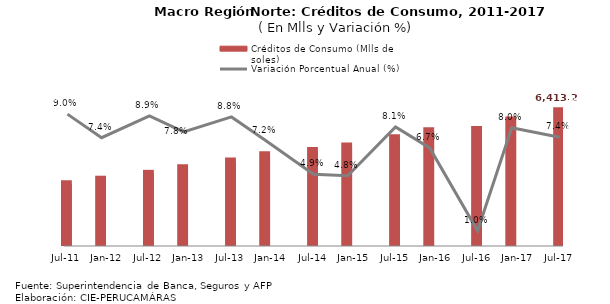
| Category | Créditos de Consumo (Mlls de soles) |
|---|---|
| 2011-07-01 | 2939.922 |
| 2011-12-01 | 3156.505 |
| 2012-07-01 | 3435.93 |
| 2012-12-01 | 3702.765 |
| 2013-07-01 | 4027.853 |
| 2013-12-01 | 4316.676 |
| 2014-07-01 | 4527.5 |
| 2014-12-01 | 4743.594 |
| 2015-07-01 | 5127.539 |
| 2015-12-01 | 5469.785 |
| 2016-07-01 | 5526.433 |
| 2016-12-01 | 5971.294 |
| 2017-07-01 | 6413.194 |